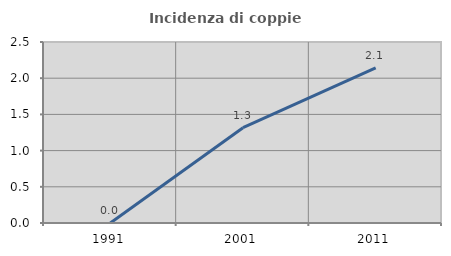
| Category | Incidenza di coppie miste |
|---|---|
| 1991.0 | 0 |
| 2001.0 | 1.316 |
| 2011.0 | 2.143 |